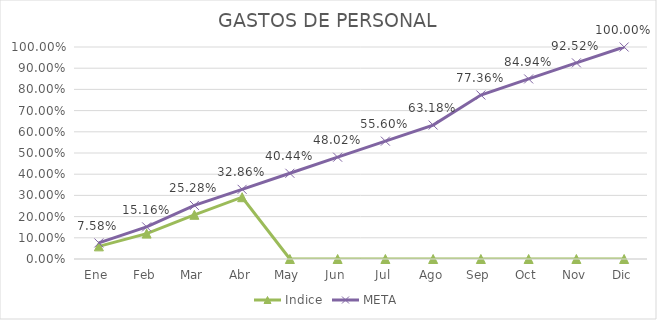
| Category | Indice | META |
|---|---|---|
| Ene | 0.06 | 0.076 |
| Feb | 0.12 | 0.152 |
| Mar | 0.208 | 0.253 |
| Abr | 0.291 | 0.329 |
| May | 0 | 0.404 |
| Jun | 0 | 0.48 |
| Jul | 0 | 0.556 |
| Ago | 0 | 0.632 |
| Sep | 0 | 0.774 |
| Oct | 0 | 0.849 |
| Nov | 0 | 0.925 |
| Dic | 0 | 1 |